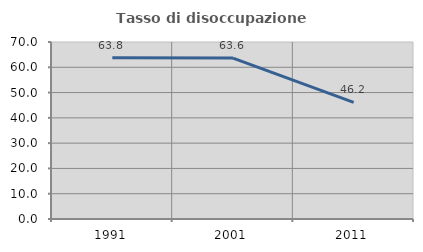
| Category | Tasso di disoccupazione giovanile  |
|---|---|
| 1991.0 | 63.768 |
| 2001.0 | 63.636 |
| 2011.0 | 46.154 |